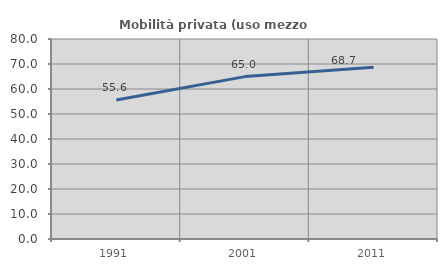
| Category | Mobilità privata (uso mezzo privato) |
|---|---|
| 1991.0 | 55.605 |
| 2001.0 | 64.957 |
| 2011.0 | 68.708 |